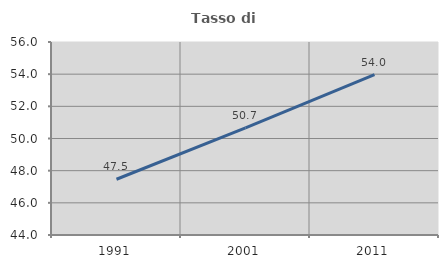
| Category | Tasso di occupazione   |
|---|---|
| 1991.0 | 47.466 |
| 2001.0 | 50.655 |
| 2011.0 | 53.971 |